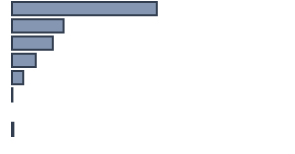
| Category | Series 0 |
|---|---|
| 0 | 52.849 |
| 1 | 18.82 |
| 2 | 14.897 |
| 3 | 8.705 |
| 4 | 4.073 |
| 5 | 0.151 |
| 6 | 0 |
| 7 | 0.505 |